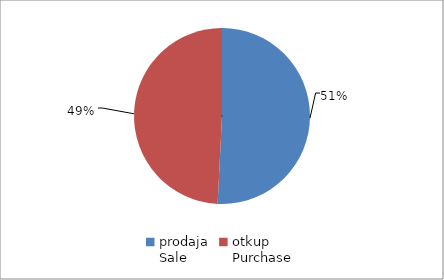
| Category | Series 0 |
|---|---|
| prodaja
Sale | 46477934.86 |
| otkup
Purchase | 45022878.17 |